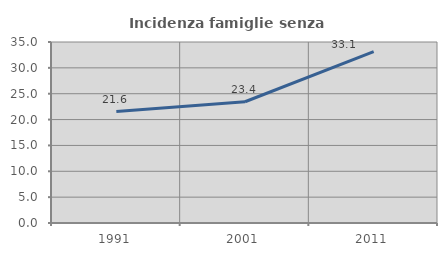
| Category | Incidenza famiglie senza nuclei |
|---|---|
| 1991.0 | 21.56 |
| 2001.0 | 23.445 |
| 2011.0 | 33.139 |